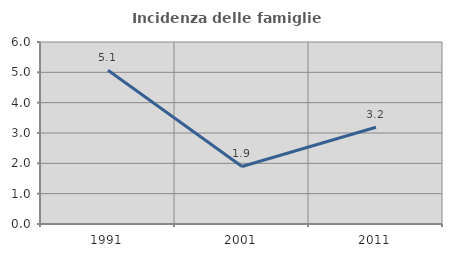
| Category | Incidenza delle famiglie numerose |
|---|---|
| 1991.0 | 5.069 |
| 2001.0 | 1.896 |
| 2011.0 | 3.189 |